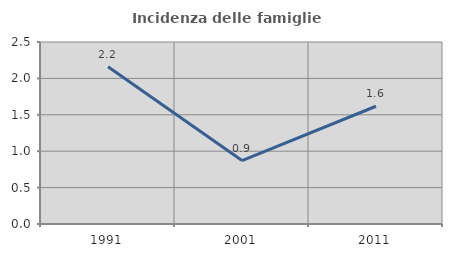
| Category | Incidenza delle famiglie numerose |
|---|---|
| 1991.0 | 2.16 |
| 2001.0 | 0.872 |
| 2011.0 | 1.617 |